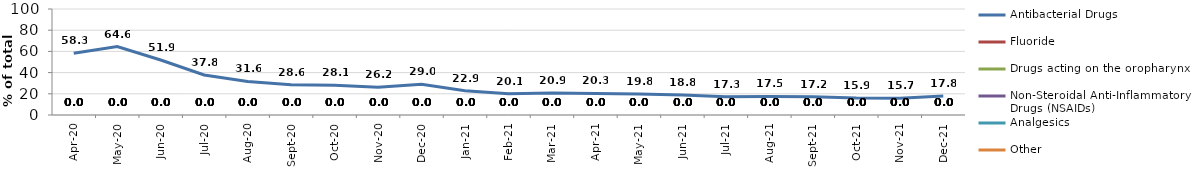
| Category | Antibacterial Drugs | Fluoride | Drugs acting on the oropharynx | Non-Steroidal Anti-Inflammatory Drugs (NSAIDs) | Analgesics | Other |
|---|---|---|---|---|---|---|
| 2020-04-01 | 58.277 |  |  |  |  |  |
| 2020-05-01 | 64.567 |  |  |  |  |  |
| 2020-06-01 | 51.912 |  |  |  |  |  |
| 2020-07-01 | 37.797 |  |  |  |  |  |
| 2020-08-01 | 31.644 |  |  |  |  |  |
| 2020-09-01 | 28.643 |  |  |  |  |  |
| 2020-10-01 | 28.113 |  |  |  |  |  |
| 2020-11-01 | 26.199 |  |  |  |  |  |
| 2020-12-01 | 29.002 |  |  |  |  |  |
| 2021-01-01 | 22.918 |  |  |  |  |  |
| 2021-02-01 | 20.113 |  |  |  |  |  |
| 2021-03-01 | 20.859 |  |  |  |  |  |
| 2021-04-01 | 20.32 |  |  |  |  |  |
| 2021-05-01 | 19.773 |  |  |  |  |  |
| 2021-06-01 | 18.835 |  |  |  |  |  |
| 2021-07-01 | 17.274 |  |  |  |  |  |
| 2021-08-01 | 17.55 |  |  |  |  |  |
| 2021-09-01 | 17.215 |  |  |  |  |  |
| 2021-10-01 | 15.945 |  |  |  |  |  |
| 2021-11-01 | 15.737 |  |  |  |  |  |
| 2021-12-01 | 17.827 |  |  |  |  |  |